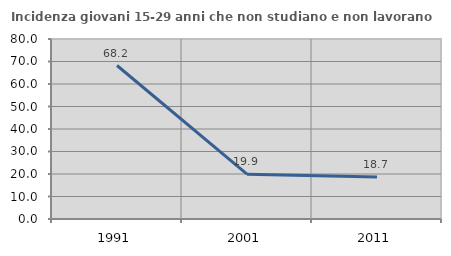
| Category | Incidenza giovani 15-29 anni che non studiano e non lavorano  |
|---|---|
| 1991.0 | 68.217 |
| 2001.0 | 19.926 |
| 2011.0 | 18.706 |